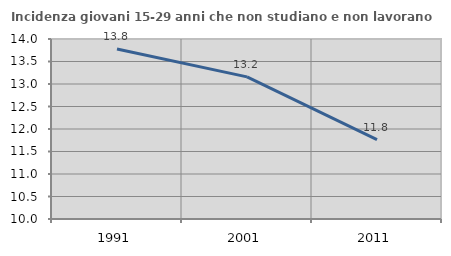
| Category | Incidenza giovani 15-29 anni che non studiano e non lavorano  |
|---|---|
| 1991.0 | 13.779 |
| 2001.0 | 13.158 |
| 2011.0 | 11.765 |